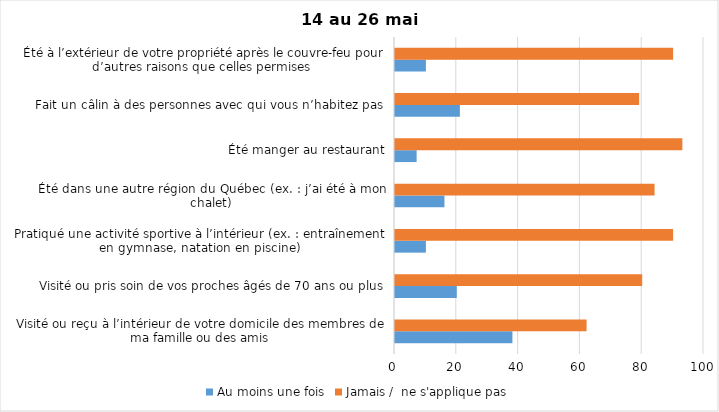
| Category | Au moins une fois | Jamais /  ne s'applique pas |
|---|---|---|
| Visité ou reçu à l’intérieur de votre domicile des membres de ma famille ou des amis | 38 | 62 |
| Visité ou pris soin de vos proches âgés de 70 ans ou plus | 20 | 80 |
| Pratiqué une activité sportive à l’intérieur (ex. : entraînement en gymnase, natation en piscine) | 10 | 90 |
| Été dans une autre région du Québec (ex. : j’ai été à mon chalet) | 16 | 84 |
| Été manger au restaurant | 7 | 93 |
| Fait un câlin à des personnes avec qui vous n’habitez pas | 21 | 79 |
| Été à l’extérieur de votre propriété après le couvre-feu pour d’autres raisons que celles permises  | 10 | 90 |